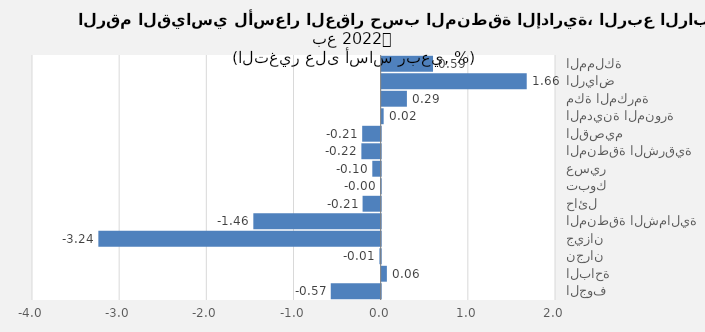
| Category | 2022 |
|---|---|
| المملكة | 0.589 |
| الرياض | 1.664 |
| مكة المكرمة | 0.29 |
| المدينة المنورة | 0.023 |
| القصيم | -0.212 |
| المنطقة الشرقية | -0.221 |
| عسير | -0.096 |
| تبوك | -0.005 |
| حائل | -0.208 |
| المنطقة الشمالية | -1.461 |
| جيزان | -3.239 |
| نجران | -0.014 |
| الباحة | 0.06 |
| الجوف | -0.573 |